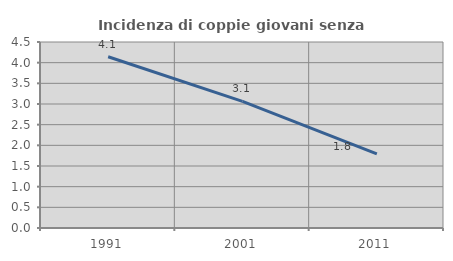
| Category | Incidenza di coppie giovani senza figli |
|---|---|
| 1991.0 | 4.142 |
| 2001.0 | 3.064 |
| 2011.0 | 1.791 |